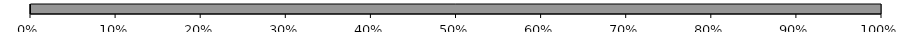
| Category | erreichte Punkte | DiffzuMax |
|---|---|---|
| 0 | 0 | 1 |